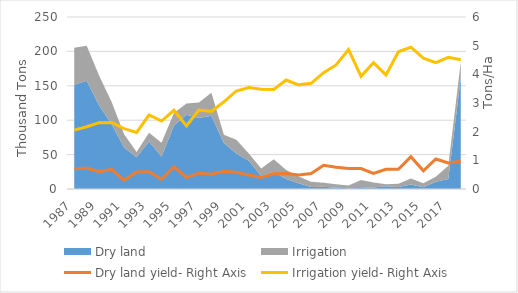
| Category | Dry land yield- Right Axis | Irrigation yield- Right Axis |
|---|---|---|
| 1987.0 | 702 | 2052 |
| 1988.0 | 728 | 2171 |
| 1989.0 | 606 | 2313 |
| 1990.0 | 685 | 2321 |
| 1991.0 | 301 | 2107 |
| 1992.0 | 590 | 1973 |
| 1993.0 | 605 | 2581 |
| 1994.0 | 341 | 2370 |
| 1995.0 | 777 | 2747 |
| 1996.0 | 402 | 2201 |
| 1997.0 | 558 | 2757 |
| 1998.0 | 515 | 2707 |
| 1999.0 | 621 | 3043 |
| 2000.0 | 583 | 3419 |
| 2001.0 | 489 | 3538 |
| 2002.0 | 402 | 3478 |
| 2003.0 | 532 | 3470 |
| 2004.0 | 542 | 3802 |
| 2005.0 | 485 | 3633 |
| 2006.0 | 541 | 3688 |
| 2007.0 | 825 | 4056 |
| 2008.0 | 757 | 4327 |
| 2009.0 | 712 | 4865 |
| 2010.0 | 715 | 3931 |
| 2011.0 | 541 | 4405 |
| 2012.0 | 687 | 3979 |
| 2013.0 | 687 | 4785 |
| 2014.0 | 1129 | 4946 |
| 2015.0 | 635 | 4563 |
| 2016.0 | 1048 | 4411 |
| 2017.0 | 910 | 4595 |
| 2018.0 | 967 | 4506 |